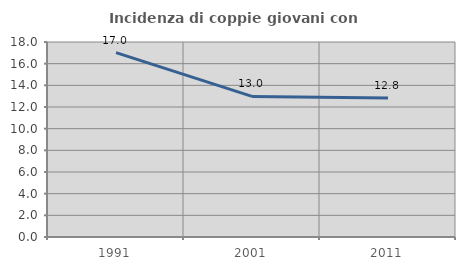
| Category | Incidenza di coppie giovani con figli |
|---|---|
| 1991.0 | 17.022 |
| 2001.0 | 12.975 |
| 2011.0 | 12.823 |